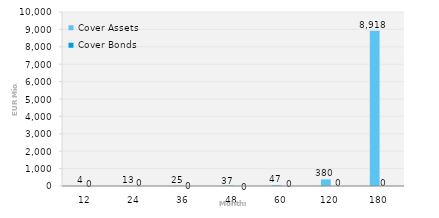
| Category | Cover Assets | Cover Bonds |
|---|---|---|
| 12.0 | 4.335 | 0 |
| 24.0 | 13.154 | 0 |
| 36.0 | 25.376 | 0 |
| 48.0 | 36.78 | 0 |
| 60.0 | 46.622 | 0 |
| 120.0 | 379.668 | 0 |
| 180.0 | 8918.128 | 0 |